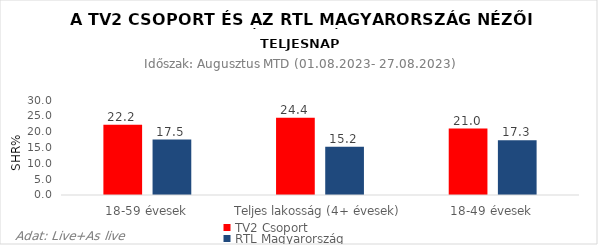
| Category | TV2 Csoport | RTL Magyarország |
|---|---|---|
| 18-59 évesek | 22.2 | 17.5 |
| Teljes lakosság (4+ évesek) | 24.4 | 15.2 |
| 18-49 évesek | 21 | 17.3 |